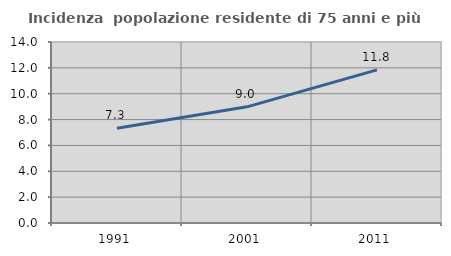
| Category | Incidenza  popolazione residente di 75 anni e più |
|---|---|
| 1991.0 | 7.335 |
| 2001.0 | 8.984 |
| 2011.0 | 11.846 |